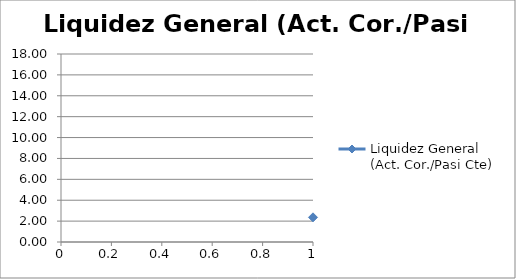
| Category | Liquidez General (Act. Cor./Pasi Cte) |
|---|---|
| 0 | 2.362 |
| 1 | 12.7 |
| 2 | 13.177 |
| 3 | 13.41 |
| 4 | 12.692 |
| 5 | 15.57 |
| 6 | 15.331 |
| 7 | 8.414 |